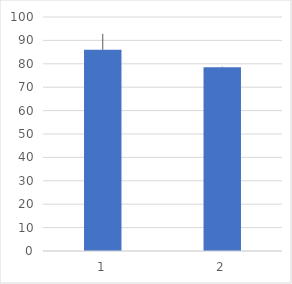
| Category | Series 0 |
|---|---|
| 0 | 86 |
| 1 | 78.5 |